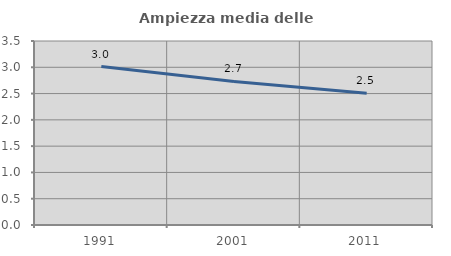
| Category | Ampiezza media delle famiglie |
|---|---|
| 1991.0 | 3.015 |
| 2001.0 | 2.731 |
| 2011.0 | 2.505 |